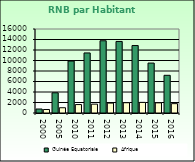
| Category | Guinée Equatoriale | Afrique                        |
|---|---|---|
| 2000.0 | 760 | 668.557 |
| 2005.0 | 3850 | 1002.896 |
| 2010.0 | 9890 | 1608.999 |
| 2011.0 | 11440 | 1686.521 |
| 2012.0 | 13760 | 1885.129 |
| 2013.0 | 13630 | 1956.671 |
| 2014.0 | 12850 | 2022.289 |
| 2015.0 | 9510 | 1932.283 |
| 2016.0 | 7180 | 1781.415 |